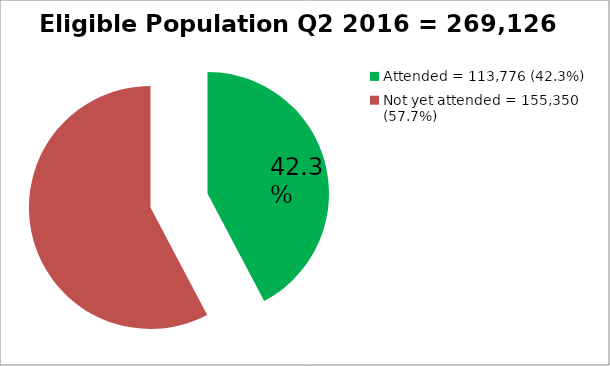
| Category | Eligible Population Q2 2016= 269,126 |
|---|---|
| Attended = 113,776 (42.3%) | 113776 |
| Not yet attended = 155,350 (57.7%)  | 155350 |